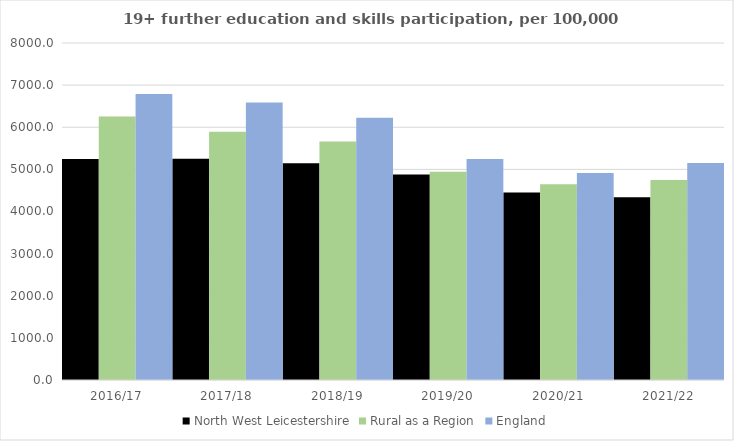
| Category | North West Leicestershire | Rural as a Region | England |
|---|---|---|---|
| 2016/17 | 5246 | 6253.401 | 6788 |
| 2017/18 | 5254 | 5892.029 | 6588 |
| 2018/19 | 5147 | 5661.873 | 6227 |
| 2019/20 | 4879 | 4943.801 | 5244 |
| 2020/21 | 4454 | 4646.727 | 4913 |
| 2021/22 | 4340 | 4747.049 | 5151 |